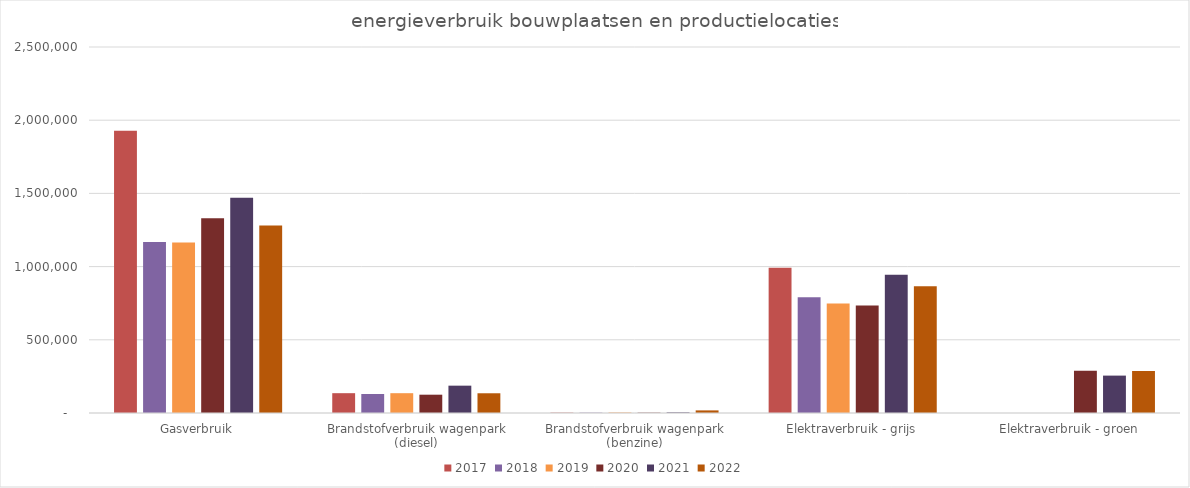
| Category | 2017 | 2018 | 2019 | 2020 | 2021 | 2022 |
|---|---|---|---|---|---|---|
| Gasverbruik | 1927682 | 1168760 | 1164965 | 1330528 | 1469688 | 1280282 |
| Brandstofverbruik wagenpark (diesel) | 135356.01 | 129821.54 | 135287.76 | 125053.55 | 186742.8 | 134811.48 |
| Brandstofverbruik wagenpark (benzine) | 2236.71 | 2034.3 | 3216.78 | 2238.83 | 4143 | 17809.56 |
| Elektraverbruik - grijs | 992444 | 789852 | 747523 | 734400 | 944526 | 864990 |
| Elektraverbruik - groen | 0 | 0 | 0 | 287990 | 255420 | 287420 |